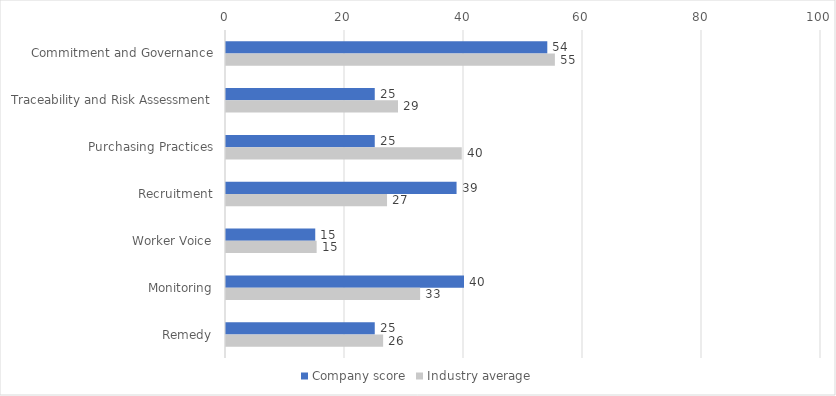
| Category | Company score | Industry average |
|---|---|---|
| Commitment and Governance | 54 | 55.275 |
| Traceability and Risk Assessment | 25 | 28.906 |
| Purchasing Practices | 25 | 39.625 |
| Recruitment | 38.75 | 27.062 |
| Worker Voice | 15 | 15.234 |
| Monitoring | 40 | 32.625 |
| Remedy | 25 | 26.406 |